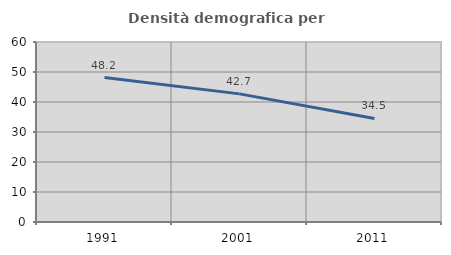
| Category | Densità demografica |
|---|---|
| 1991.0 | 48.164 |
| 2001.0 | 42.712 |
| 2011.0 | 34.533 |